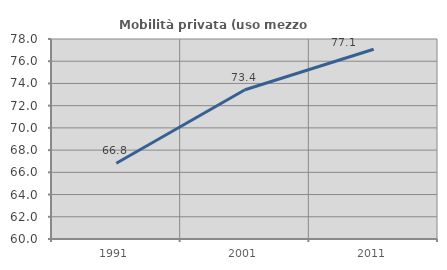
| Category | Mobilità privata (uso mezzo privato) |
|---|---|
| 1991.0 | 66.818 |
| 2001.0 | 73.432 |
| 2011.0 | 77.078 |